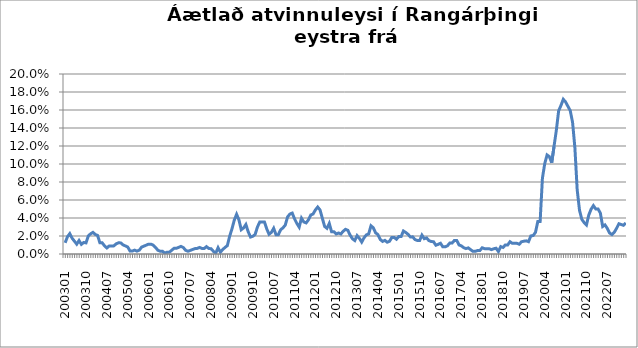
| Category | Series 0 |
|---|---|
| 200301 | 0.012 |
| 200302 | 0.019 |
| 200303 | 0.023 |
| 200304 | 0.018 |
| 200305 | 0.014 |
| 200306 | 0.011 |
| 200307 | 0.015 |
| 200308 | 0.011 |
| 200309 | 0.013 |
| 200310 | 0.012 |
| 200311 | 0.02 |
| 200312 | 0.022 |
| 200401 | 0.024 |
| 200402 | 0.022 |
| 200403 | 0.021 |
| 200404 | 0.012 |
| 200405 | 0.012 |
| 200406 | 0.009 |
| 200407 | 0.007 |
| 200408 | 0.009 |
| 200409 | 0.009 |
| 200410 | 0.009 |
| 200411 | 0.011 |
| 200412 | 0.012 |
| 200501 | 0.012 |
| 200502 | 0.01 |
| 200503 | 0.009 |
| 200504 | 0.008 |
| 200505 | 0.003 |
| 200506 | 0.003 |
| 200507 | 0.004 |
| 200508 | 0.003 |
| 200509 | 0.004 |
| 200510 | 0.008 |
| 200511 | 0.009 |
| 200512 | 0.01 |
| 200601 | 0.011 |
| 200602 | 0.011 |
| 200603 | 0.01 |
| 200604 | 0.007 |
| 200605 | 0.004 |
| 200606 | 0.003 |
| 200607 | 0.003 |
| 200608 | 0.001 |
| 200609 | 0.002 |
| 200610 | 0.002 |
| 200611 | 0.004 |
| 200612 | 0.006 |
| 200701 | 0.006 |
| 200702 | 0.007 |
| 200703 | 0.008 |
| 200704 | 0.007 |
| 200705 | 0.004 |
| 200706 | 0.003 |
| 200707 | 0.004 |
| 200708 | 0.005 |
| 200709 | 0.006 |
| 200710 | 0.006 |
| 200711 | 0.007 |
| 200712 | 0.006 |
| 200801 | 0.006 |
| 200802 | 0.008 |
| 200803 | 0.006 |
| 200804 | 0.006 |
| 200805 | 0.003 |
| 200806 | 0.001 |
| 200807 | 0.007 |
| 200808 | 0.002 |
| 200809 | 0.005 |
| 200810 | 0.007 |
| 200811 | 0.009 |
| 200812 | 0.02 |
| 200901 | 0.028 |
| 200902 | 0.038 |
| 200903 | 0.044 |
| 200904 | 0.038 |
| 200905 | 0.027 |
| 200906 | 0.029 |
| 200907 | 0.033 |
| 200908 | 0.025 |
| 200909 | 0.019 |
| 200910 | 0.02 |
| 200911 | 0.022 |
| 200912 | 0.03 |
| 201001 | 0.036 |
| 201002 | 0.036 |
| 201003 | 0.036 |
| 201004 | 0.028 |
| 201005 | 0.022 |
| 201006 | 0.024 |
| 201007 | 0.029 |
| 201008 | 0.021 |
| 201009 | 0.021 |
| 201010 | 0.027 |
| 201011 | 0.029 |
| 201012 | 0.032 |
| 201101 | 0.041 |
| 201102 | 0.044 |
| 201103 | 0.045 |
| 201104 | 0.039 |
| 201105 | 0.034 |
| 201106 | 0.03 |
| 201107 | 0.04 |
| 201108 | 0.036 |
| 201109 | 0.035 |
| 201110 | 0.038 |
| 201111 | 0.043 |
| 201112 | 0.044 |
| 201201 | 0.049 |
| 201202 | 0.052 |
| 201203 | 0.049 |
| 201204 | 0.04 |
| 201205 | 0.031 |
| 201206 | 0.029 |
| 201207 | 0.034 |
| 201208 | 0.025 |
| 201209 | 0.025 |
| 201210 | 0.022 |
| 201211 | 0.023 |
| 201212 | 0.022 |
| 201301 | 0.025 |
| 201302 | 0.027 |
| 201303 | 0.026 |
| 201304 | 0.021 |
| 201305 | 0.017 |
| 201306 | 0.015 |
| 201307 | 0.02 |
| 201308 | 0.017 |
| 201309 | 0.013 |
| 201310 | 0.018 |
| 201311 | 0.021 |
| 201312 | 0.022 |
| 201401 | 0.031 |
| 201402 | 0.029 |
| 201403 | 0.024 |
| 201404 | 0.022 |
| 201405 | 0.016 |
| 201406 | 0.014 |
| 201407 | 0.015 |
| 201408 | 0.013 |
| 201409 | 0.014 |
| 201410 | 0.018 |
| 201411 | 0.018 |
| 201412 | 0.016 |
| 201501 | 0.019 |
| 201502 | 0.019 |
| 201503 | 0.026 |
| 201504 | 0.024 |
| 201505 | 0.022 |
| 201506 | 0.019 |
| 201507 | 0.019 |
| 201508 | 0.016 |
| 201509 | 0.015 |
| 201510 | 0.015 |
| 201511 | 0.021 |
| 201512 | 0.017 |
| 201601 | 0.018 |
| 201602 | 0.015 |
| 201603 | 0.014 |
| 201604 | 0.014 |
| 201605 | 0.01 |
| 201606 | 0.011 |
| 201607 | 0.012 |
| 201608 | 0.008 |
| 201609 | 0.008 |
| 201610 | 0.009 |
| 201611 | 0.012 |
| 201612 | 0.012 |
| 201701 | 0.015 |
| 201702 | 0.015 |
| 201703 | 0.01 |
| 201704 | 0.009 |
| 201705 | 0.007 |
| 201706 | 0.006 |
| 201707 | 0.007 |
| 201708 | 0.005 |
| 201709 | 0.003 |
| 201710 | 0.003 |
| 201711 | 0.004 |
| 201712 | 0.004 |
| 201801 | 0.007 |
| 201802 | 0.006 |
| 201803 | 0.006 |
| 201804 | 0.006 |
| 201805 | 0.005 |
| 201806 | 0.006 |
| 201807 | 0.006 |
| 201808 | 0.003 |
| 201809 | 0.008 |
| 201810 | 0.007 |
| 201811 | 0.01 |
| 201812 | 0.01 |
| 201901 | 0.014 |
| 201902 | 0.012 |
| 201903 | 0.012 |
| 201904 | 0.012 |
| 201905 | 0.011 |
| 201906 | 0.014 |
| 201907 | 0.014 |
| 201908 | 0.015 |
| 201909 | 0.014 |
| 201910 | 0.02 |
| 201911 | 0.02 |
| 201912 | 0.024 |
| 202001 | 0.036 |
| 202002 | 0.036 |
| 202003 | 0.084 |
| 202004 | 0.1 |
| 202005 | 0.11 |
| 202006 | 0.108 |
| 202007 | 0.101 |
| 202008 | 0.119 |
| 202009 | 0.137 |
| 202010 | 0.159 |
| 202011 | 0.165 |
| 202012 | 0.172 |
| 202101 | 0.169 |
| 202102 | 0.164 |
| 202103 | 0.159 |
| 202104 | 0.146 |
| 202105 | 0.118 |
| 202106 | 0.071 |
| 202107 | 0.049 |
| 202108 | 0.039 |
| 202109 | 0.035 |
| 202110 | 0.032 |
| 202111 | 0.043 |
| 202112 | 0.05 |
| 202201 | 0.054 |
| 202202 | 0.05 |
| 202203 | 0.05 |
| 202204 | 0.045 |
| 202205 | 0.031 |
| 202206 | 0.032 |
| 202207 | 0.028 |
| 202208 | 0.023 |
| 202209 | 0.022 |
| 202210 | 0.024 |
| 202211 | 0.028 |
| 202212 | 0.034 |
| 202301 | 0.033 |
| 202302 | 0.032 |
| 202303 | 0.035 |